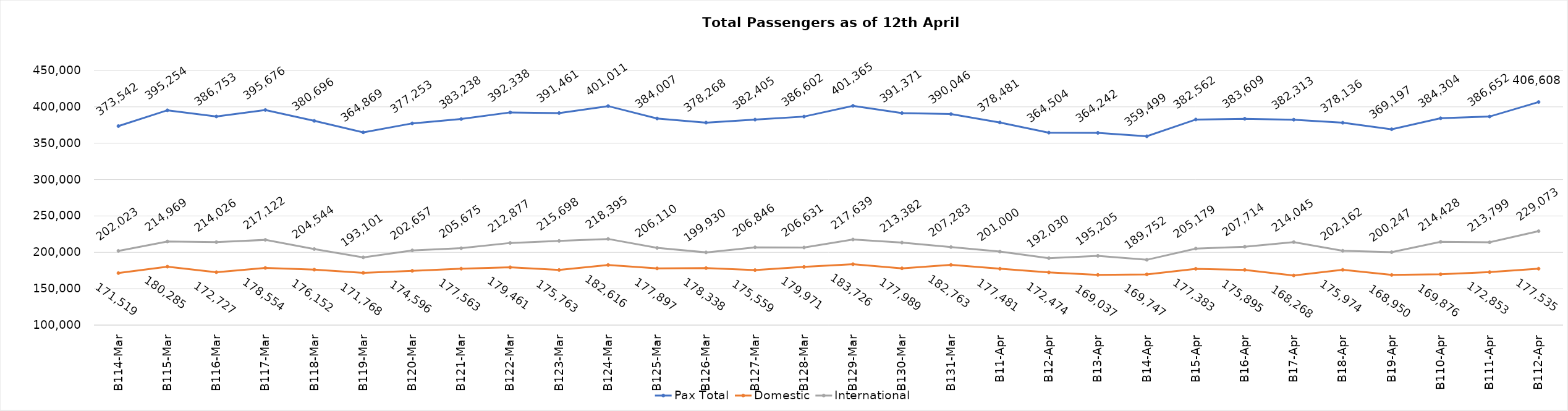
| Category | Pax Total | Domestic | International |
|---|---|---|---|
| 2024-03-14 | 373542 | 171519 | 202023 |
| 2024-03-15 | 395254 | 180285 | 214969 |
| 2024-03-16 | 386753 | 172727 | 214026 |
| 2024-03-17 | 395676 | 178554 | 217122 |
| 2024-03-18 | 380696 | 176152 | 204544 |
| 2024-03-19 | 364869 | 171768 | 193101 |
| 2024-03-20 | 377253 | 174596 | 202657 |
| 2024-03-21 | 383238 | 177563 | 205675 |
| 2024-03-22 | 392338 | 179461 | 212877 |
| 2024-03-23 | 391461 | 175763 | 215698 |
| 2024-03-24 | 401011 | 182616 | 218395 |
| 2024-03-25 | 384007 | 177897 | 206110 |
| 2024-03-26 | 378268 | 178338 | 199930 |
| 2024-03-27 | 382405 | 175559 | 206846 |
| 2024-03-28 | 386602 | 179971 | 206631 |
| 2024-03-29 | 401365 | 183726 | 217639 |
| 2024-03-30 | 391371 | 177989 | 213382 |
| 2024-03-31 | 390046 | 182763 | 207283 |
| 2024-04-01 | 378481 | 177481 | 201000 |
| 2024-04-02 | 364504 | 172474 | 192030 |
| 2024-04-03 | 364242 | 169037 | 195205 |
| 2024-04-04 | 359499 | 169747 | 189752 |
| 2024-04-05 | 382562 | 177383 | 205179 |
| 2024-04-06 | 383609 | 175895 | 207714 |
| 2024-04-07 | 382313 | 168268 | 214045 |
| 2024-04-08 | 378136 | 175974 | 202162 |
| 2024-04-09 | 369197 | 168950 | 200247 |
| 2024-04-10 | 384304 | 169876 | 214428 |
| 2024-04-11 | 386652 | 172853 | 213799 |
| 2024-04-12 | 406608 | 177535 | 229073 |